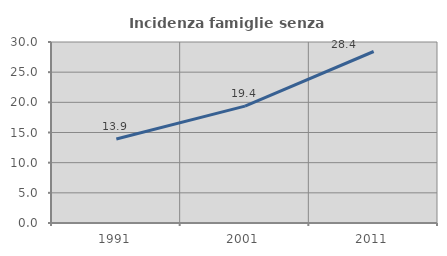
| Category | Incidenza famiglie senza nuclei |
|---|---|
| 1991.0 | 13.913 |
| 2001.0 | 19.365 |
| 2011.0 | 28.425 |